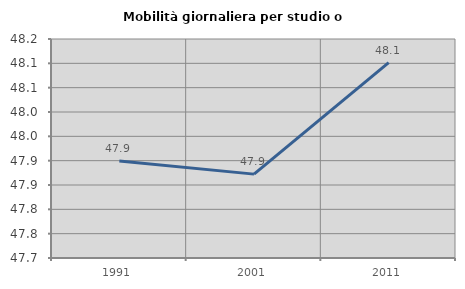
| Category | Mobilità giornaliera per studio o lavoro |
|---|---|
| 1991.0 | 47.899 |
| 2001.0 | 47.872 |
| 2011.0 | 48.101 |